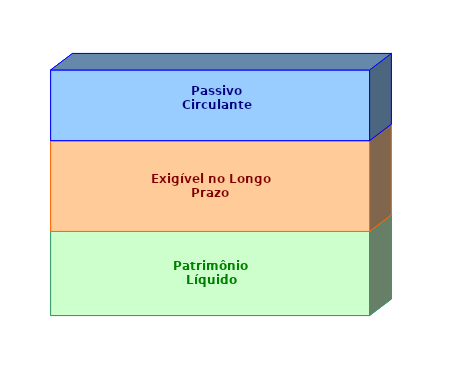
| Category | Patrimônio Líquido | Exigível no Longo Prazo | Passivo Circulante |
|---|---|---|---|
| 0 | 0.343 | 0.37 | 0.288 |